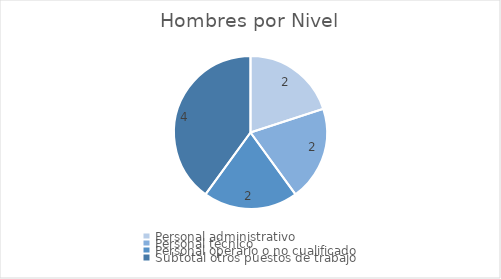
| Category | Nº hombres en ese nivel |
|---|---|
| Personal administrativo | 2 |
| Personal técnico  | 2 |
| Personal operario o no cualificado  | 2 |
| Subtotal otros puestos de trabajo | 4 |